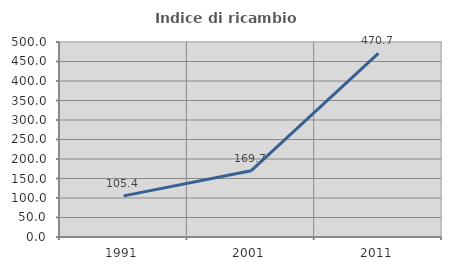
| Category | Indice di ricambio occupazionale  |
|---|---|
| 1991.0 | 105.389 |
| 2001.0 | 169.748 |
| 2011.0 | 470.69 |